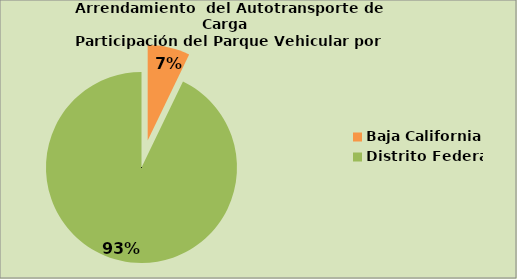
| Category | Series 0 |
|---|---|
| Baja California | 7.148 |
| Distrito Federal | 92.818 |